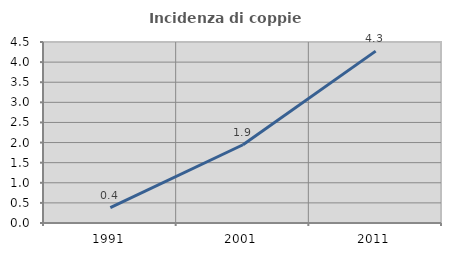
| Category | Incidenza di coppie miste |
|---|---|
| 1991.0 | 0.382 |
| 2001.0 | 1.946 |
| 2011.0 | 4.274 |